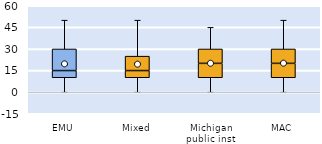
| Category | 25th | 50th | 75th |
|---|---|---|---|
| EMU | 10 | 5 | 15 |
| Mixed | 10 | 5 | 10 |
| Michigan public inst | 10 | 10 | 10 |
| MAC | 10 | 10 | 10 |